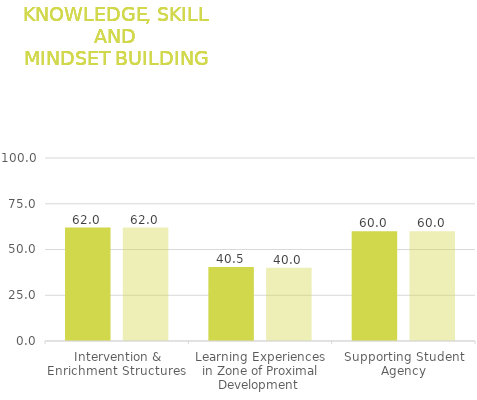
| Category | Time 1 | Time 2 |
|---|---|---|
| Intervention & Enrichment Structures  | 62 | 62 |
| Learning Experiences in Zone of Proximal Development  | 40.5 | 40 |
| Supporting Student Agency | 60 | 60 |